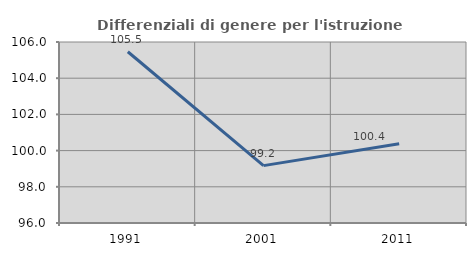
| Category | Differenziali di genere per l'istruzione superiore |
|---|---|
| 1991.0 | 105.462 |
| 2001.0 | 99.171 |
| 2011.0 | 100.377 |